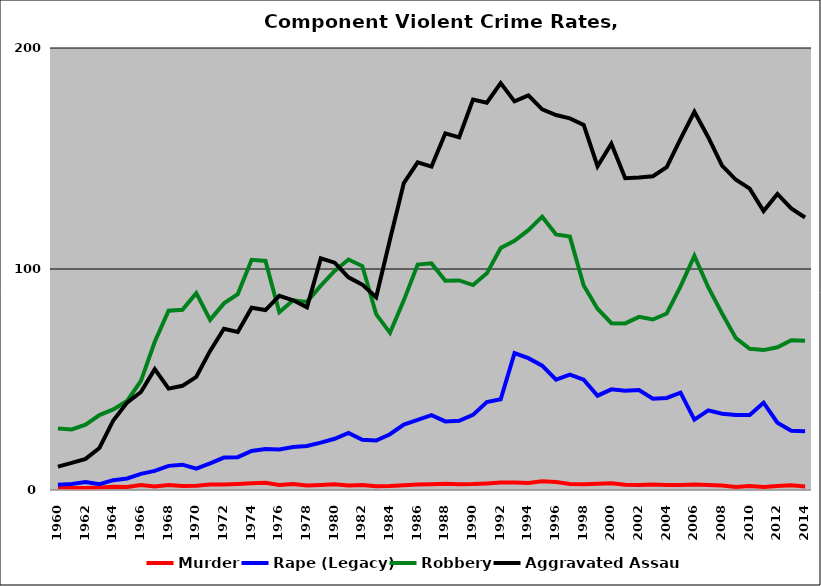
| Category | Murder | Rape (Legacy) | Robbery | Aggravated Assault |
|---|---|---|---|---|
| 1960.0 | 1.23 | 2.373 | 27.828 | 10.604 |
| 1961.0 | 0.98 | 2.709 | 27.406 | 12.277 |
| 1962.0 | 0.95 | 3.568 | 29.583 | 14.072 |
| 1963.0 | 1.171 | 2.6 | 33.886 | 19 |
| 1964.0 | 1.448 | 4.459 | 36.495 | 31.468 |
| 1965.0 | 1.407 | 5.234 | 40.321 | 39.533 |
| 1966.0 | 2.209 | 7.299 | 49.357 | 44.351 |
| 1967.0 | 1.619 | 8.626 | 67.058 | 54.662 |
| 1968.0 | 2.222 | 10.916 | 81.157 | 45.886 |
| 1969.0 | 1.865 | 11.459 | 81.514 | 47.135 |
| 1970.0 | 1.971 | 9.698 | 89.065 | 51.221 |
| 1971.0 | 2.448 | 12.059 | 76.965 | 62.948 |
| 1972.0 | 2.438 | 14.656 | 84.446 | 72.947 |
| 1973.0 | 2.746 | 14.858 | 88.658 | 71.465 |
| 1974.0 | 3.013 | 17.667 | 104.136 | 82.461 |
| 1975.0 | 3.286 | 18.594 | 103.642 | 81.431 |
| 1976.0 | 2.32 | 18.31 | 80.429 | 87.894 |
| 1977.0 | 2.667 | 19.472 | 85.862 | 85.836 |
| 1978.0 | 2.021 | 19.885 | 85.105 | 82.635 |
| 1979.0 | 2.291 | 21.453 | 92.463 | 104.803 |
| 1980.0 | 2.61 | 23.195 | 99.108 | 102.85 |
| 1981.0 | 2.078 | 25.819 | 104.303 | 96.259 |
| 1982.0 | 2.299 | 22.695 | 101.331 | 92.935 |
| 1983.0 | 1.665 | 22.37 | 79.585 | 87.235 |
| 1984.0 | 1.778 | 25.252 | 71.12 | 113.335 |
| 1985.0 | 2.099 | 29.621 | 85.81 | 138.874 |
| 1986.0 | 2.492 | 31.751 | 102.017 | 148.291 |
| 1987.0 | 2.638 | 33.891 | 102.544 | 146.326 |
| 1988.0 | 2.88 | 31.05 | 94.728 | 161.403 |
| 1989.0 | 2.55 | 31.312 | 94.831 | 159.591 |
| 1990.0 | 2.674 | 33.988 | 92.729 | 176.705 |
| 1991.0 | 2.956 | 39.756 | 98.037 | 175.271 |
| 1992.0 | 3.348 | 41.071 | 109.509 | 184.107 |
| 1993.0 | 3.431 | 61.899 | 112.73 | 175.847 |
| 1994.0 | 3.219 | 59.667 | 117.583 | 178.564 |
| 1995.0 | 3.948 | 56.247 | 123.688 | 172.213 |
| 1996.0 | 3.585 | 49.957 | 115.608 | 169.665 |
| 1997.0 | 2.753 | 52.198 | 114.661 | 168.139 |
| 1998.0 | 2.561 | 49.905 | 92.508 | 165.206 |
| 1999.0 | 2.806 | 42.676 | 82.023 | 146.498 |
| 2000.0 | 3.069 | 45.533 | 75.475 | 156.704 |
| 2001.0 | 2.387 | 44.859 | 75.393 | 141.076 |
| 2002.0 | 2.229 | 45.236 | 78.352 | 141.419 |
| 2003.0 | 2.508 | 41.31 | 77.13 | 141.998 |
| 2004.0 | 2.217 | 41.656 | 79.858 | 146.079 |
| 2005.0 | 2.243 | 44.044 | 92.144 | 158.892 |
| 2006.0 | 2.458 | 31.836 | 105.901 | 171.121 |
| 2007.0 | 2.232 | 36.036 | 91.754 | 159.65 |
| 2008.0 | 2.084 | 34.509 | 79.896 | 146.791 |
| 2009.0 | 1.405 | 33.971 | 68.721 | 140.366 |
| 2010.0 | 1.81 | 33.899 | 63.877 | 136.371 |
| 2011.0 | 1.403 | 39.515 | 63.303 | 126.232 |
| 2012.0 | 1.84 | 30.448 | 64.595 | 133.968 |
| 2013.0 | 2.103 | 26.798 | 67.76 | 127.405 |
| 2014.0 | 1.613 | 26.607 | 67.562 | 123.306 |